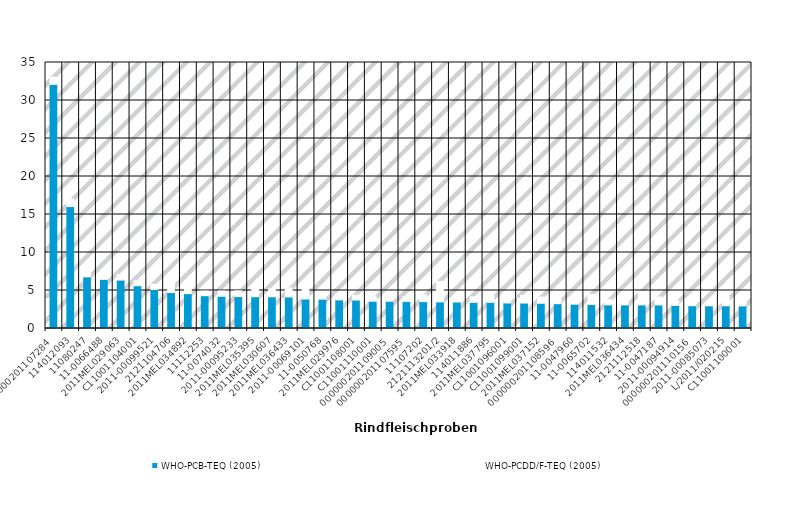
| Category | WHO-PCB-TEQ (2005) | WHO-PCDD/F-TEQ (2005) |
|---|---|---|
| 000000201107284 | 32.121 | 0.941 |
| 114012093 | 16.045 | 1.004 |
| 11080247 | 6.797 | 1.48 |
| 11-0066488 | 6.465 | 0.797 |
| 2011MEL029063 | 6.374 | 0.729 |
| C11001104001 | 5.634 | 0.652 |
| 2011-00099521 | 5.147 | 0.671 |
| 2121104706 | 4.728 | 1.128 |
| 2011MEL034892 | 4.582 | 0.758 |
| 11112253 | 4.319 | 0.6 |
| 11-0074032 | 4.241 | 0.695 |
| 2011-00095233 | 4.196 | 0.759 |
| 2011MEL035395 | 4.181 | 1.237 |
| 2011MEL030607 | 4.177 | 1.012 |
| 2011MEL036433 | 4.15 | 1.181 |
| 2011-00069101 | 3.879 | 1.752 |
| 11-0050768 | 3.859 | 0.982 |
| 2011MEL029976 | 3.771 | 0.767 |
| C11001108001 | 3.747 | 0.629 |
| C11001110001 | 3.594 | 0.637 |
| 000000201109005 | 3.585 | 0.523 |
| 000000201107595 | 3.564 | 0.629 |
| 11107202 | 3.541 | 0.864 |
| 2121113201/2 | 3.507 | 2.679 |
| 2011MEL033918 | 3.491 | 0.793 |
| 114011886 | 3.444 | 0.716 |
| 2011MEL037795 | 3.442 | 0.987 |
| C11001096001 | 3.361 | 0.661 |
| C11001099001 | 3.347 | 0.999 |
| 2011MEL037152 | 3.321 | 0.816 |
| 000000201108596 | 3.267 | 0.566 |
| 11-0047960 | 3.202 | 0.99 |
| 11-0065702 | 3.173 | 1.308 |
| 114011532 | 3.108 | 0.676 |
| 2011MEL036434 | 3.108 | 0.472 |
| 2121112518 | 3.107 | 1.757 |
| 11-0047187 | 3.096 | 1.048 |
| 2011-00094914 | 3.038 | 0.595 |
| 000000201110156 | 2.999 | 0.651 |
| 2011-00085073 | 2.987 | 0.43 |
| L/2011/020215 | 2.986 | 1.254 |
| C11001100001 | 2.972 | 0.913 |